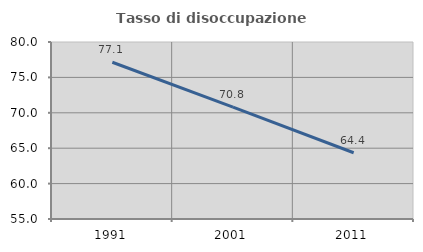
| Category | Tasso di disoccupazione giovanile  |
|---|---|
| 1991.0 | 77.138 |
| 2001.0 | 70.81 |
| 2011.0 | 64.354 |